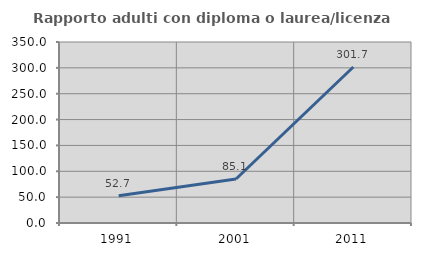
| Category | Rapporto adulti con diploma o laurea/licenza media  |
|---|---|
| 1991.0 | 52.716 |
| 2001.0 | 85.117 |
| 2011.0 | 301.688 |